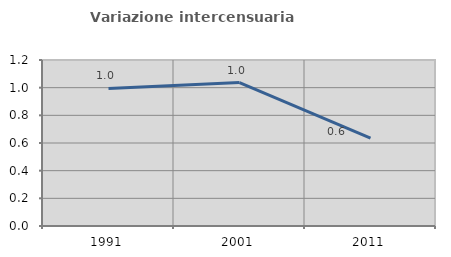
| Category | Variazione intercensuaria annua |
|---|---|
| 1991.0 | 0.994 |
| 2001.0 | 1.037 |
| 2011.0 | 0.635 |